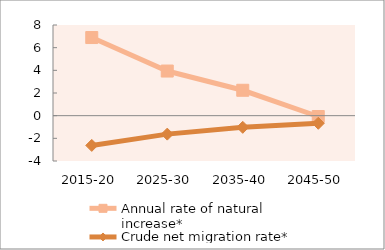
| Category | Annual rate of natural increase* | Crude net migration rate* |
|---|---|---|
| 2015-20 | 6.893 | -2.625 |
| 2025-30 | 3.938 | -1.629 |
| 2035-40 | 2.241 | -1.028 |
| 2045-50 | -0.074 | -0.671 |